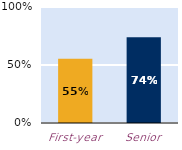
| Category | At least some |
|---|---|
| First-year | 0.554 |
| Senior | 0.739 |